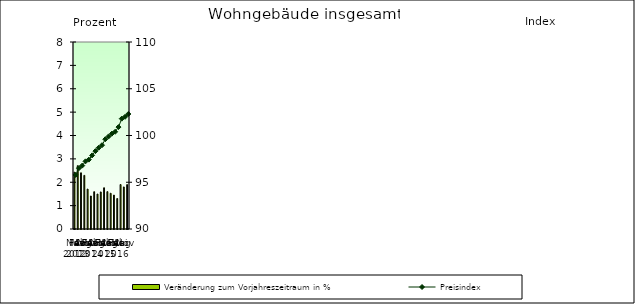
| Category | Veränderung zum Vorjahreszeitraum in % |
|---|---|
| 0 | 2.43 |
| 1 | 2.708 |
| 2 | 2.404 |
| 3 | 2.294 |
| 4 | 1.708 |
| 5 | 1.412 |
| 6 | 1.596 |
| 7 | 1.495 |
| 8 | 1.586 |
| 9 | 1.764 |
| 10 | 1.599 |
| 11 | 1.529 |
| 12 | 1.451 |
| 13 | 1.305 |
| 14 | 1.902 |
| 15 | 1.8 |
| 16 | 1.9 |